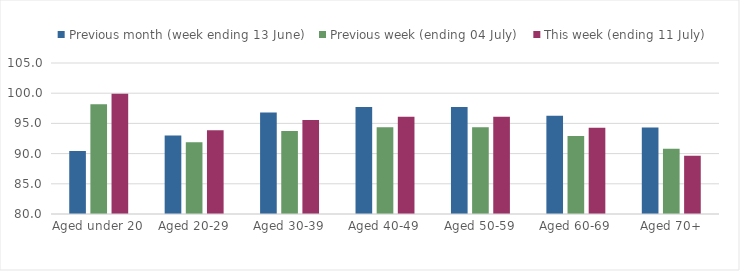
| Category | Previous month (week ending 13 June) | Previous week (ending 04 July) | This week (ending 11 July) |
|---|---|---|---|
| Aged under 20 | 90.429 | 98.158 | 99.894 |
| Aged 20-29 | 93.012 | 91.882 | 93.846 |
| Aged 30-39 | 96.825 | 93.73 | 95.567 |
| Aged 40-49 | 97.708 | 94.375 | 96.103 |
| Aged 50-59 | 97.721 | 94.36 | 96.117 |
| Aged 60-69 | 96.285 | 92.897 | 94.283 |
| Aged 70+ | 94.311 | 90.821 | 89.645 |